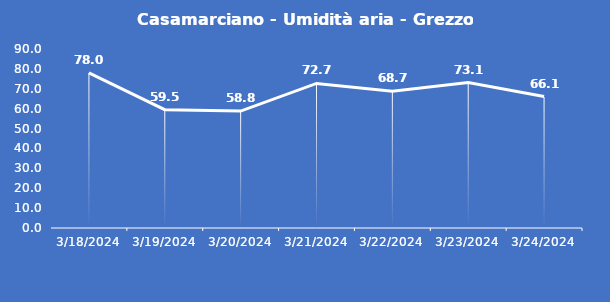
| Category | Casamarciano - Umidità aria - Grezzo (%) |
|---|---|
| 3/18/24 | 78 |
| 3/19/24 | 59.5 |
| 3/20/24 | 58.8 |
| 3/21/24 | 72.7 |
| 3/22/24 | 68.7 |
| 3/23/24 | 73.1 |
| 3/24/24 | 66.1 |